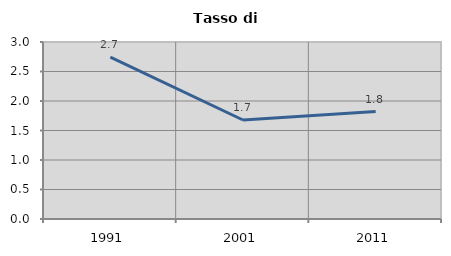
| Category | Tasso di disoccupazione   |
|---|---|
| 1991.0 | 2.743 |
| 2001.0 | 1.678 |
| 2011.0 | 1.821 |